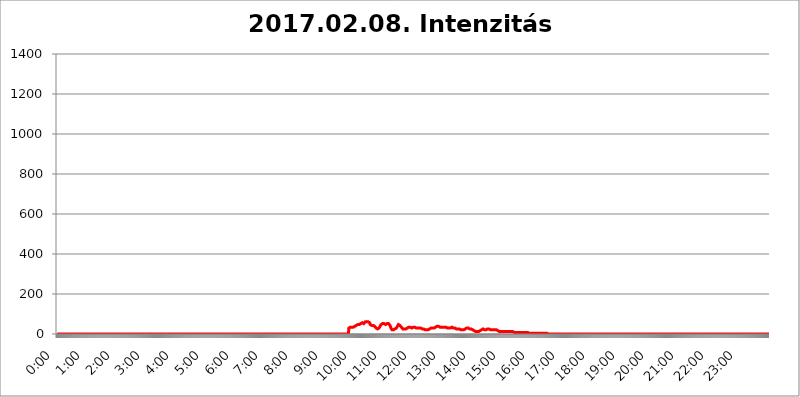
| Category | 2017.02.08. Intenzitás [W/m^2] |
|---|---|
| 0.0 | 0 |
| 0.0006944444444444445 | 0 |
| 0.001388888888888889 | 0 |
| 0.0020833333333333333 | 0 |
| 0.002777777777777778 | 0 |
| 0.003472222222222222 | 0 |
| 0.004166666666666667 | 0 |
| 0.004861111111111111 | 0 |
| 0.005555555555555556 | 0 |
| 0.0062499999999999995 | 0 |
| 0.006944444444444444 | 0 |
| 0.007638888888888889 | 0 |
| 0.008333333333333333 | 0 |
| 0.009027777777777779 | 0 |
| 0.009722222222222222 | 0 |
| 0.010416666666666666 | 0 |
| 0.011111111111111112 | 0 |
| 0.011805555555555555 | 0 |
| 0.012499999999999999 | 0 |
| 0.013194444444444444 | 0 |
| 0.013888888888888888 | 0 |
| 0.014583333333333332 | 0 |
| 0.015277777777777777 | 0 |
| 0.015972222222222224 | 0 |
| 0.016666666666666666 | 0 |
| 0.017361111111111112 | 0 |
| 0.018055555555555557 | 0 |
| 0.01875 | 0 |
| 0.019444444444444445 | 0 |
| 0.02013888888888889 | 0 |
| 0.020833333333333332 | 0 |
| 0.02152777777777778 | 0 |
| 0.022222222222222223 | 0 |
| 0.02291666666666667 | 0 |
| 0.02361111111111111 | 0 |
| 0.024305555555555556 | 0 |
| 0.024999999999999998 | 0 |
| 0.025694444444444447 | 0 |
| 0.02638888888888889 | 0 |
| 0.027083333333333334 | 0 |
| 0.027777777777777776 | 0 |
| 0.02847222222222222 | 0 |
| 0.029166666666666664 | 0 |
| 0.029861111111111113 | 0 |
| 0.030555555555555555 | 0 |
| 0.03125 | 0 |
| 0.03194444444444445 | 0 |
| 0.03263888888888889 | 0 |
| 0.03333333333333333 | 0 |
| 0.034027777777777775 | 0 |
| 0.034722222222222224 | 0 |
| 0.035416666666666666 | 0 |
| 0.036111111111111115 | 0 |
| 0.03680555555555556 | 0 |
| 0.0375 | 0 |
| 0.03819444444444444 | 0 |
| 0.03888888888888889 | 0 |
| 0.03958333333333333 | 0 |
| 0.04027777777777778 | 0 |
| 0.04097222222222222 | 0 |
| 0.041666666666666664 | 0 |
| 0.042361111111111106 | 0 |
| 0.04305555555555556 | 0 |
| 0.043750000000000004 | 0 |
| 0.044444444444444446 | 0 |
| 0.04513888888888889 | 0 |
| 0.04583333333333334 | 0 |
| 0.04652777777777778 | 0 |
| 0.04722222222222222 | 0 |
| 0.04791666666666666 | 0 |
| 0.04861111111111111 | 0 |
| 0.049305555555555554 | 0 |
| 0.049999999999999996 | 0 |
| 0.05069444444444445 | 0 |
| 0.051388888888888894 | 0 |
| 0.052083333333333336 | 0 |
| 0.05277777777777778 | 0 |
| 0.05347222222222222 | 0 |
| 0.05416666666666667 | 0 |
| 0.05486111111111111 | 0 |
| 0.05555555555555555 | 0 |
| 0.05625 | 0 |
| 0.05694444444444444 | 0 |
| 0.057638888888888885 | 0 |
| 0.05833333333333333 | 0 |
| 0.05902777777777778 | 0 |
| 0.059722222222222225 | 0 |
| 0.06041666666666667 | 0 |
| 0.061111111111111116 | 0 |
| 0.06180555555555556 | 0 |
| 0.0625 | 0 |
| 0.06319444444444444 | 0 |
| 0.06388888888888888 | 0 |
| 0.06458333333333334 | 0 |
| 0.06527777777777778 | 0 |
| 0.06597222222222222 | 0 |
| 0.06666666666666667 | 0 |
| 0.06736111111111111 | 0 |
| 0.06805555555555555 | 0 |
| 0.06874999999999999 | 0 |
| 0.06944444444444443 | 0 |
| 0.07013888888888889 | 0 |
| 0.07083333333333333 | 0 |
| 0.07152777777777779 | 0 |
| 0.07222222222222223 | 0 |
| 0.07291666666666667 | 0 |
| 0.07361111111111111 | 0 |
| 0.07430555555555556 | 0 |
| 0.075 | 0 |
| 0.07569444444444444 | 0 |
| 0.0763888888888889 | 0 |
| 0.07708333333333334 | 0 |
| 0.07777777777777778 | 0 |
| 0.07847222222222222 | 0 |
| 0.07916666666666666 | 0 |
| 0.0798611111111111 | 0 |
| 0.08055555555555556 | 0 |
| 0.08125 | 0 |
| 0.08194444444444444 | 0 |
| 0.08263888888888889 | 0 |
| 0.08333333333333333 | 0 |
| 0.08402777777777777 | 0 |
| 0.08472222222222221 | 0 |
| 0.08541666666666665 | 0 |
| 0.08611111111111112 | 0 |
| 0.08680555555555557 | 0 |
| 0.08750000000000001 | 0 |
| 0.08819444444444445 | 0 |
| 0.08888888888888889 | 0 |
| 0.08958333333333333 | 0 |
| 0.09027777777777778 | 0 |
| 0.09097222222222222 | 0 |
| 0.09166666666666667 | 0 |
| 0.09236111111111112 | 0 |
| 0.09305555555555556 | 0 |
| 0.09375 | 0 |
| 0.09444444444444444 | 0 |
| 0.09513888888888888 | 0 |
| 0.09583333333333333 | 0 |
| 0.09652777777777777 | 0 |
| 0.09722222222222222 | 0 |
| 0.09791666666666667 | 0 |
| 0.09861111111111111 | 0 |
| 0.09930555555555555 | 0 |
| 0.09999999999999999 | 0 |
| 0.10069444444444443 | 0 |
| 0.1013888888888889 | 0 |
| 0.10208333333333335 | 0 |
| 0.10277777777777779 | 0 |
| 0.10347222222222223 | 0 |
| 0.10416666666666667 | 0 |
| 0.10486111111111111 | 0 |
| 0.10555555555555556 | 0 |
| 0.10625 | 0 |
| 0.10694444444444444 | 0 |
| 0.1076388888888889 | 0 |
| 0.10833333333333334 | 0 |
| 0.10902777777777778 | 0 |
| 0.10972222222222222 | 0 |
| 0.1111111111111111 | 0 |
| 0.11180555555555556 | 0 |
| 0.11180555555555556 | 0 |
| 0.1125 | 0 |
| 0.11319444444444444 | 0 |
| 0.11388888888888889 | 0 |
| 0.11458333333333333 | 0 |
| 0.11527777777777777 | 0 |
| 0.11597222222222221 | 0 |
| 0.11666666666666665 | 0 |
| 0.1173611111111111 | 0 |
| 0.11805555555555557 | 0 |
| 0.11944444444444445 | 0 |
| 0.12013888888888889 | 0 |
| 0.12083333333333333 | 0 |
| 0.12152777777777778 | 0 |
| 0.12222222222222223 | 0 |
| 0.12291666666666667 | 0 |
| 0.12291666666666667 | 0 |
| 0.12361111111111112 | 0 |
| 0.12430555555555556 | 0 |
| 0.125 | 0 |
| 0.12569444444444444 | 0 |
| 0.12638888888888888 | 0 |
| 0.12708333333333333 | 0 |
| 0.16875 | 0 |
| 0.12847222222222224 | 0 |
| 0.12916666666666668 | 0 |
| 0.12986111111111112 | 0 |
| 0.13055555555555556 | 0 |
| 0.13125 | 0 |
| 0.13194444444444445 | 0 |
| 0.1326388888888889 | 0 |
| 0.13333333333333333 | 0 |
| 0.13402777777777777 | 0 |
| 0.13402777777777777 | 0 |
| 0.13472222222222222 | 0 |
| 0.13541666666666666 | 0 |
| 0.1361111111111111 | 0 |
| 0.13749999999999998 | 0 |
| 0.13819444444444443 | 0 |
| 0.1388888888888889 | 0 |
| 0.13958333333333334 | 0 |
| 0.14027777777777778 | 0 |
| 0.14097222222222222 | 0 |
| 0.14166666666666666 | 0 |
| 0.1423611111111111 | 0 |
| 0.14305555555555557 | 0 |
| 0.14375000000000002 | 0 |
| 0.14444444444444446 | 0 |
| 0.1451388888888889 | 0 |
| 0.1451388888888889 | 0 |
| 0.14652777777777778 | 0 |
| 0.14722222222222223 | 0 |
| 0.14791666666666667 | 0 |
| 0.1486111111111111 | 0 |
| 0.14930555555555555 | 0 |
| 0.15 | 0 |
| 0.15069444444444444 | 0 |
| 0.15138888888888888 | 0 |
| 0.15208333333333332 | 0 |
| 0.15277777777777776 | 0 |
| 0.15347222222222223 | 0 |
| 0.15416666666666667 | 0 |
| 0.15486111111111112 | 0 |
| 0.15555555555555556 | 0 |
| 0.15625 | 0 |
| 0.15694444444444444 | 0 |
| 0.15763888888888888 | 0 |
| 0.15833333333333333 | 0 |
| 0.15902777777777777 | 0 |
| 0.15972222222222224 | 0 |
| 0.16041666666666668 | 0 |
| 0.16111111111111112 | 0 |
| 0.16180555555555556 | 0 |
| 0.1625 | 0 |
| 0.16319444444444445 | 0 |
| 0.1638888888888889 | 0 |
| 0.16458333333333333 | 0 |
| 0.16527777777777777 | 0 |
| 0.16597222222222222 | 0 |
| 0.16666666666666666 | 0 |
| 0.1673611111111111 | 0 |
| 0.16805555555555554 | 0 |
| 0.16874999999999998 | 0 |
| 0.16944444444444443 | 0 |
| 0.17013888888888887 | 0 |
| 0.1708333333333333 | 0 |
| 0.17152777777777775 | 0 |
| 0.17222222222222225 | 0 |
| 0.1729166666666667 | 0 |
| 0.17361111111111113 | 0 |
| 0.17430555555555557 | 0 |
| 0.17500000000000002 | 0 |
| 0.17569444444444446 | 0 |
| 0.1763888888888889 | 0 |
| 0.17708333333333334 | 0 |
| 0.17777777777777778 | 0 |
| 0.17847222222222223 | 0 |
| 0.17916666666666667 | 0 |
| 0.1798611111111111 | 0 |
| 0.18055555555555555 | 0 |
| 0.18125 | 0 |
| 0.18194444444444444 | 0 |
| 0.1826388888888889 | 0 |
| 0.18333333333333335 | 0 |
| 0.1840277777777778 | 0 |
| 0.18472222222222223 | 0 |
| 0.18541666666666667 | 0 |
| 0.18611111111111112 | 0 |
| 0.18680555555555556 | 0 |
| 0.1875 | 0 |
| 0.18819444444444444 | 0 |
| 0.18888888888888888 | 0 |
| 0.18958333333333333 | 0 |
| 0.19027777777777777 | 0 |
| 0.1909722222222222 | 0 |
| 0.19166666666666665 | 0 |
| 0.19236111111111112 | 0 |
| 0.19305555555555554 | 0 |
| 0.19375 | 0 |
| 0.19444444444444445 | 0 |
| 0.1951388888888889 | 0 |
| 0.19583333333333333 | 0 |
| 0.19652777777777777 | 0 |
| 0.19722222222222222 | 0 |
| 0.19791666666666666 | 0 |
| 0.1986111111111111 | 0 |
| 0.19930555555555554 | 0 |
| 0.19999999999999998 | 0 |
| 0.20069444444444443 | 0 |
| 0.20138888888888887 | 0 |
| 0.2020833333333333 | 0 |
| 0.2027777777777778 | 0 |
| 0.2034722222222222 | 0 |
| 0.2041666666666667 | 0 |
| 0.20486111111111113 | 0 |
| 0.20555555555555557 | 0 |
| 0.20625000000000002 | 0 |
| 0.20694444444444446 | 0 |
| 0.2076388888888889 | 0 |
| 0.20833333333333334 | 0 |
| 0.20902777777777778 | 0 |
| 0.20972222222222223 | 0 |
| 0.21041666666666667 | 0 |
| 0.2111111111111111 | 0 |
| 0.21180555555555555 | 0 |
| 0.2125 | 0 |
| 0.21319444444444444 | 0 |
| 0.2138888888888889 | 0 |
| 0.21458333333333335 | 0 |
| 0.2152777777777778 | 0 |
| 0.21597222222222223 | 0 |
| 0.21666666666666667 | 0 |
| 0.21736111111111112 | 0 |
| 0.21805555555555556 | 0 |
| 0.21875 | 0 |
| 0.21944444444444444 | 0 |
| 0.22013888888888888 | 0 |
| 0.22083333333333333 | 0 |
| 0.22152777777777777 | 0 |
| 0.2222222222222222 | 0 |
| 0.22291666666666665 | 0 |
| 0.2236111111111111 | 0 |
| 0.22430555555555556 | 0 |
| 0.225 | 0 |
| 0.22569444444444445 | 0 |
| 0.2263888888888889 | 0 |
| 0.22708333333333333 | 0 |
| 0.22777777777777777 | 0 |
| 0.22847222222222222 | 0 |
| 0.22916666666666666 | 0 |
| 0.2298611111111111 | 0 |
| 0.23055555555555554 | 0 |
| 0.23124999999999998 | 0 |
| 0.23194444444444443 | 0 |
| 0.23263888888888887 | 0 |
| 0.2333333333333333 | 0 |
| 0.2340277777777778 | 0 |
| 0.2347222222222222 | 0 |
| 0.2354166666666667 | 0 |
| 0.23611111111111113 | 0 |
| 0.23680555555555557 | 0 |
| 0.23750000000000002 | 0 |
| 0.23819444444444446 | 0 |
| 0.2388888888888889 | 0 |
| 0.23958333333333334 | 0 |
| 0.24027777777777778 | 0 |
| 0.24097222222222223 | 0 |
| 0.24166666666666667 | 0 |
| 0.2423611111111111 | 0 |
| 0.24305555555555555 | 0 |
| 0.24375 | 0 |
| 0.24444444444444446 | 0 |
| 0.24513888888888888 | 0 |
| 0.24583333333333335 | 0 |
| 0.2465277777777778 | 0 |
| 0.24722222222222223 | 0 |
| 0.24791666666666667 | 0 |
| 0.24861111111111112 | 0 |
| 0.24930555555555556 | 0 |
| 0.25 | 0 |
| 0.25069444444444444 | 0 |
| 0.2513888888888889 | 0 |
| 0.2520833333333333 | 0 |
| 0.25277777777777777 | 0 |
| 0.2534722222222222 | 0 |
| 0.25416666666666665 | 0 |
| 0.2548611111111111 | 0 |
| 0.2555555555555556 | 0 |
| 0.25625000000000003 | 0 |
| 0.2569444444444445 | 0 |
| 0.2576388888888889 | 0 |
| 0.25833333333333336 | 0 |
| 0.2590277777777778 | 0 |
| 0.25972222222222224 | 0 |
| 0.2604166666666667 | 0 |
| 0.2611111111111111 | 0 |
| 0.26180555555555557 | 0 |
| 0.2625 | 0 |
| 0.26319444444444445 | 0 |
| 0.2638888888888889 | 0 |
| 0.26458333333333334 | 0 |
| 0.2652777777777778 | 0 |
| 0.2659722222222222 | 0 |
| 0.26666666666666666 | 0 |
| 0.2673611111111111 | 0 |
| 0.26805555555555555 | 0 |
| 0.26875 | 0 |
| 0.26944444444444443 | 0 |
| 0.2701388888888889 | 0 |
| 0.2708333333333333 | 0 |
| 0.27152777777777776 | 0 |
| 0.2722222222222222 | 0 |
| 0.27291666666666664 | 0 |
| 0.2736111111111111 | 0 |
| 0.2743055555555555 | 0 |
| 0.27499999999999997 | 0 |
| 0.27569444444444446 | 0 |
| 0.27638888888888885 | 0 |
| 0.27708333333333335 | 0 |
| 0.2777777777777778 | 0 |
| 0.27847222222222223 | 0 |
| 0.2791666666666667 | 0 |
| 0.2798611111111111 | 0 |
| 0.28055555555555556 | 0 |
| 0.28125 | 0 |
| 0.28194444444444444 | 0 |
| 0.2826388888888889 | 0 |
| 0.2833333333333333 | 0 |
| 0.28402777777777777 | 0 |
| 0.2847222222222222 | 0 |
| 0.28541666666666665 | 0 |
| 0.28611111111111115 | 0 |
| 0.28680555555555554 | 0 |
| 0.28750000000000003 | 0 |
| 0.2881944444444445 | 0 |
| 0.2888888888888889 | 0 |
| 0.28958333333333336 | 0 |
| 0.2902777777777778 | 0 |
| 0.29097222222222224 | 0 |
| 0.2916666666666667 | 0 |
| 0.2923611111111111 | 0 |
| 0.29305555555555557 | 0 |
| 0.29375 | 0 |
| 0.29444444444444445 | 0 |
| 0.2951388888888889 | 0 |
| 0.29583333333333334 | 0 |
| 0.2965277777777778 | 0 |
| 0.2972222222222222 | 0 |
| 0.29791666666666666 | 0 |
| 0.2986111111111111 | 0 |
| 0.29930555555555555 | 0 |
| 0.3 | 0 |
| 0.30069444444444443 | 0 |
| 0.3013888888888889 | 0 |
| 0.3020833333333333 | 0 |
| 0.30277777777777776 | 0 |
| 0.3034722222222222 | 0 |
| 0.30416666666666664 | 0 |
| 0.3048611111111111 | 0 |
| 0.3055555555555555 | 0 |
| 0.30624999999999997 | 0 |
| 0.3069444444444444 | 0 |
| 0.3076388888888889 | 0 |
| 0.30833333333333335 | 0 |
| 0.3090277777777778 | 0 |
| 0.30972222222222223 | 0 |
| 0.3104166666666667 | 0 |
| 0.3111111111111111 | 0 |
| 0.31180555555555556 | 0 |
| 0.3125 | 0 |
| 0.31319444444444444 | 0 |
| 0.3138888888888889 | 0 |
| 0.3145833333333333 | 0 |
| 0.31527777777777777 | 0 |
| 0.3159722222222222 | 0 |
| 0.31666666666666665 | 0 |
| 0.31736111111111115 | 0 |
| 0.31805555555555554 | 0 |
| 0.31875000000000003 | 0 |
| 0.3194444444444445 | 0 |
| 0.3201388888888889 | 0 |
| 0.32083333333333336 | 0 |
| 0.3215277777777778 | 0 |
| 0.32222222222222224 | 0 |
| 0.3229166666666667 | 0 |
| 0.3236111111111111 | 0 |
| 0.32430555555555557 | 0 |
| 0.325 | 0 |
| 0.32569444444444445 | 0 |
| 0.3263888888888889 | 0 |
| 0.32708333333333334 | 0 |
| 0.3277777777777778 | 0 |
| 0.3284722222222222 | 0 |
| 0.32916666666666666 | 0 |
| 0.3298611111111111 | 0 |
| 0.33055555555555555 | 0 |
| 0.33125 | 0 |
| 0.33194444444444443 | 0 |
| 0.3326388888888889 | 0 |
| 0.3333333333333333 | 0 |
| 0.3340277777777778 | 0 |
| 0.3347222222222222 | 0 |
| 0.3354166666666667 | 0 |
| 0.3361111111111111 | 0 |
| 0.3368055555555556 | 0 |
| 0.33749999999999997 | 0 |
| 0.33819444444444446 | 0 |
| 0.33888888888888885 | 0 |
| 0.33958333333333335 | 0 |
| 0.34027777777777773 | 0 |
| 0.34097222222222223 | 0 |
| 0.3416666666666666 | 0 |
| 0.3423611111111111 | 0 |
| 0.3430555555555555 | 0 |
| 0.34375 | 0 |
| 0.3444444444444445 | 0 |
| 0.3451388888888889 | 0 |
| 0.3458333333333334 | 0 |
| 0.34652777777777777 | 0 |
| 0.34722222222222227 | 0 |
| 0.34791666666666665 | 0 |
| 0.34861111111111115 | 0 |
| 0.34930555555555554 | 0 |
| 0.35000000000000003 | 0 |
| 0.3506944444444444 | 0 |
| 0.3513888888888889 | 0 |
| 0.3520833333333333 | 0 |
| 0.3527777777777778 | 0 |
| 0.3534722222222222 | 0 |
| 0.3541666666666667 | 0 |
| 0.3548611111111111 | 0 |
| 0.35555555555555557 | 0 |
| 0.35625 | 0 |
| 0.35694444444444445 | 0 |
| 0.3576388888888889 | 0 |
| 0.35833333333333334 | 0 |
| 0.3590277777777778 | 0 |
| 0.3597222222222222 | 0 |
| 0.36041666666666666 | 0 |
| 0.3611111111111111 | 0 |
| 0.36180555555555555 | 0 |
| 0.3625 | 0 |
| 0.36319444444444443 | 0 |
| 0.3638888888888889 | 0 |
| 0.3645833333333333 | 0 |
| 0.3652777777777778 | 0 |
| 0.3659722222222222 | 0 |
| 0.3666666666666667 | 0 |
| 0.3673611111111111 | 0 |
| 0.3680555555555556 | 0 |
| 0.36874999999999997 | 0 |
| 0.36944444444444446 | 0 |
| 0.37013888888888885 | 0 |
| 0.37083333333333335 | 0 |
| 0.37152777777777773 | 0 |
| 0.37222222222222223 | 0 |
| 0.3729166666666666 | 0 |
| 0.3736111111111111 | 0 |
| 0.3743055555555555 | 0 |
| 0.375 | 0 |
| 0.3756944444444445 | 0 |
| 0.3763888888888889 | 0 |
| 0.3770833333333334 | 0 |
| 0.37777777777777777 | 0 |
| 0.37847222222222227 | 0 |
| 0.37916666666666665 | 0 |
| 0.37986111111111115 | 0 |
| 0.38055555555555554 | 0 |
| 0.38125000000000003 | 0 |
| 0.3819444444444444 | 0 |
| 0.3826388888888889 | 0 |
| 0.3833333333333333 | 0 |
| 0.3840277777777778 | 0 |
| 0.3847222222222222 | 0 |
| 0.3854166666666667 | 0 |
| 0.3861111111111111 | 0 |
| 0.38680555555555557 | 0 |
| 0.3875 | 0 |
| 0.38819444444444445 | 0 |
| 0.3888888888888889 | 0 |
| 0.38958333333333334 | 0 |
| 0.3902777777777778 | 0 |
| 0.3909722222222222 | 0 |
| 0.39166666666666666 | 0 |
| 0.3923611111111111 | 0 |
| 0.39305555555555555 | 0 |
| 0.39375 | 0 |
| 0.39444444444444443 | 0 |
| 0.3951388888888889 | 0 |
| 0.3958333333333333 | 0 |
| 0.3965277777777778 | 0 |
| 0.3972222222222222 | 0 |
| 0.3979166666666667 | 0 |
| 0.3986111111111111 | 0 |
| 0.3993055555555556 | 0 |
| 0.39999999999999997 | 0 |
| 0.40069444444444446 | 0 |
| 0.40138888888888885 | 0 |
| 0.40208333333333335 | 0 |
| 0.40277777777777773 | 0 |
| 0.40347222222222223 | 0 |
| 0.4041666666666666 | 0 |
| 0.4048611111111111 | 0 |
| 0.4055555555555555 | 0 |
| 0.40625 | 0 |
| 0.4069444444444445 | 0 |
| 0.4076388888888889 | 0 |
| 0.4083333333333334 | 0 |
| 0.40902777777777777 | 29.823 |
| 0.40972222222222227 | 34.234 |
| 0.41041666666666665 | 34.234 |
| 0.41111111111111115 | 34.234 |
| 0.41180555555555554 | 34.234 |
| 0.41250000000000003 | 34.234 |
| 0.4131944444444444 | 34.234 |
| 0.4138888888888889 | 34.234 |
| 0.4145833333333333 | 34.234 |
| 0.4152777777777778 | 34.234 |
| 0.4159722222222222 | 34.234 |
| 0.4166666666666667 | 34.234 |
| 0.4173611111111111 | 38.653 |
| 0.41805555555555557 | 38.653 |
| 0.41875 | 38.653 |
| 0.41944444444444445 | 43.079 |
| 0.4201388888888889 | 47.511 |
| 0.42083333333333334 | 47.511 |
| 0.4215277777777778 | 47.511 |
| 0.4222222222222222 | 47.511 |
| 0.42291666666666666 | 47.511 |
| 0.4236111111111111 | 47.511 |
| 0.42430555555555555 | 47.511 |
| 0.425 | 51.951 |
| 0.42569444444444443 | 51.951 |
| 0.4263888888888889 | 51.951 |
| 0.4270833333333333 | 51.951 |
| 0.4277777777777778 | 56.398 |
| 0.4284722222222222 | 51.951 |
| 0.4291666666666667 | 51.951 |
| 0.4298611111111111 | 51.951 |
| 0.4305555555555556 | 56.398 |
| 0.43124999999999997 | 56.398 |
| 0.43194444444444446 | 60.85 |
| 0.43263888888888885 | 60.85 |
| 0.43333333333333335 | 56.398 |
| 0.43402777777777773 | 60.85 |
| 0.43472222222222223 | 60.85 |
| 0.4354166666666666 | 60.85 |
| 0.4361111111111111 | 60.85 |
| 0.4368055555555555 | 60.85 |
| 0.4375 | 56.398 |
| 0.4381944444444445 | 56.398 |
| 0.4388888888888889 | 47.511 |
| 0.4395833333333334 | 47.511 |
| 0.44027777777777777 | 47.511 |
| 0.44097222222222227 | 43.079 |
| 0.44166666666666665 | 43.079 |
| 0.44236111111111115 | 47.511 |
| 0.44305555555555554 | 43.079 |
| 0.44375000000000003 | 43.079 |
| 0.4444444444444444 | 38.653 |
| 0.4451388888888889 | 38.653 |
| 0.4458333333333333 | 34.234 |
| 0.4465277777777778 | 34.234 |
| 0.4472222222222222 | 29.823 |
| 0.4479166666666667 | 29.823 |
| 0.4486111111111111 | 25.419 |
| 0.44930555555555557 | 25.419 |
| 0.45 | 29.823 |
| 0.45069444444444445 | 29.823 |
| 0.4513888888888889 | 29.823 |
| 0.45208333333333334 | 34.234 |
| 0.4527777777777778 | 38.653 |
| 0.4534722222222222 | 43.079 |
| 0.45416666666666666 | 47.511 |
| 0.4548611111111111 | 47.511 |
| 0.45555555555555555 | 51.951 |
| 0.45625 | 51.951 |
| 0.45694444444444443 | 51.951 |
| 0.4576388888888889 | 51.951 |
| 0.4583333333333333 | 51.951 |
| 0.4590277777777778 | 51.951 |
| 0.4597222222222222 | 47.511 |
| 0.4604166666666667 | 47.511 |
| 0.4611111111111111 | 47.511 |
| 0.4618055555555556 | 51.951 |
| 0.46249999999999997 | 51.951 |
| 0.46319444444444446 | 51.951 |
| 0.46388888888888885 | 51.951 |
| 0.46458333333333335 | 51.951 |
| 0.46527777777777773 | 47.511 |
| 0.46597222222222223 | 47.511 |
| 0.4666666666666666 | 43.079 |
| 0.4673611111111111 | 38.653 |
| 0.4680555555555555 | 29.823 |
| 0.46875 | 25.419 |
| 0.4694444444444445 | 21.024 |
| 0.4701388888888889 | 21.024 |
| 0.4708333333333334 | 21.024 |
| 0.47152777777777777 | 21.024 |
| 0.47222222222222227 | 21.024 |
| 0.47291666666666665 | 21.024 |
| 0.47361111111111115 | 25.419 |
| 0.47430555555555554 | 25.419 |
| 0.47500000000000003 | 29.823 |
| 0.4756944444444444 | 29.823 |
| 0.4763888888888889 | 34.234 |
| 0.4770833333333333 | 38.653 |
| 0.4777777777777778 | 43.079 |
| 0.4784722222222222 | 47.511 |
| 0.4791666666666667 | 47.511 |
| 0.4798611111111111 | 43.079 |
| 0.48055555555555557 | 43.079 |
| 0.48125 | 43.079 |
| 0.48194444444444445 | 38.653 |
| 0.4826388888888889 | 34.234 |
| 0.48333333333333334 | 29.823 |
| 0.4840277777777778 | 29.823 |
| 0.4847222222222222 | 25.419 |
| 0.48541666666666666 | 25.419 |
| 0.4861111111111111 | 25.419 |
| 0.48680555555555555 | 25.419 |
| 0.4875 | 25.419 |
| 0.48819444444444443 | 25.419 |
| 0.4888888888888889 | 25.419 |
| 0.4895833333333333 | 29.823 |
| 0.4902777777777778 | 29.823 |
| 0.4909722222222222 | 29.823 |
| 0.4916666666666667 | 34.234 |
| 0.4923611111111111 | 34.234 |
| 0.4930555555555556 | 34.234 |
| 0.49374999999999997 | 34.234 |
| 0.49444444444444446 | 34.234 |
| 0.49513888888888885 | 34.234 |
| 0.49583333333333335 | 29.823 |
| 0.49652777777777773 | 29.823 |
| 0.49722222222222223 | 29.823 |
| 0.4979166666666666 | 34.234 |
| 0.4986111111111111 | 34.234 |
| 0.4993055555555555 | 34.234 |
| 0.5 | 34.234 |
| 0.5006944444444444 | 34.234 |
| 0.5013888888888889 | 34.234 |
| 0.5020833333333333 | 34.234 |
| 0.5027777777777778 | 34.234 |
| 0.5034722222222222 | 29.823 |
| 0.5041666666666667 | 29.823 |
| 0.5048611111111111 | 29.823 |
| 0.5055555555555555 | 29.823 |
| 0.50625 | 29.823 |
| 0.5069444444444444 | 29.823 |
| 0.5076388888888889 | 29.823 |
| 0.5083333333333333 | 29.823 |
| 0.5090277777777777 | 29.823 |
| 0.5097222222222222 | 29.823 |
| 0.5104166666666666 | 29.823 |
| 0.5111111111111112 | 25.419 |
| 0.5118055555555555 | 25.419 |
| 0.5125000000000001 | 25.419 |
| 0.5131944444444444 | 25.419 |
| 0.513888888888889 | 25.419 |
| 0.5145833333333333 | 25.419 |
| 0.5152777777777778 | 21.024 |
| 0.5159722222222222 | 21.024 |
| 0.5166666666666667 | 21.024 |
| 0.517361111111111 | 21.024 |
| 0.5180555555555556 | 21.024 |
| 0.5187499999999999 | 21.024 |
| 0.5194444444444445 | 21.024 |
| 0.5201388888888888 | 21.024 |
| 0.5208333333333334 | 21.024 |
| 0.5215277777777778 | 21.024 |
| 0.5222222222222223 | 25.419 |
| 0.5229166666666667 | 25.419 |
| 0.5236111111111111 | 29.823 |
| 0.5243055555555556 | 29.823 |
| 0.525 | 29.823 |
| 0.5256944444444445 | 29.823 |
| 0.5263888888888889 | 29.823 |
| 0.5270833333333333 | 29.823 |
| 0.5277777777777778 | 29.823 |
| 0.5284722222222222 | 29.823 |
| 0.5291666666666667 | 29.823 |
| 0.5298611111111111 | 29.823 |
| 0.5305555555555556 | 34.234 |
| 0.53125 | 34.234 |
| 0.5319444444444444 | 34.234 |
| 0.5326388888888889 | 38.653 |
| 0.5333333333333333 | 38.653 |
| 0.5340277777777778 | 38.653 |
| 0.5347222222222222 | 38.653 |
| 0.5354166666666667 | 38.653 |
| 0.5361111111111111 | 34.234 |
| 0.5368055555555555 | 34.234 |
| 0.5375 | 34.234 |
| 0.5381944444444444 | 34.234 |
| 0.5388888888888889 | 34.234 |
| 0.5395833333333333 | 34.234 |
| 0.5402777777777777 | 34.234 |
| 0.5409722222222222 | 34.234 |
| 0.5416666666666666 | 29.823 |
| 0.5423611111111112 | 34.234 |
| 0.5430555555555555 | 34.234 |
| 0.5437500000000001 | 34.234 |
| 0.5444444444444444 | 34.234 |
| 0.545138888888889 | 34.234 |
| 0.5458333333333333 | 29.823 |
| 0.5465277777777778 | 29.823 |
| 0.5472222222222222 | 29.823 |
| 0.5479166666666667 | 29.823 |
| 0.548611111111111 | 29.823 |
| 0.5493055555555556 | 29.823 |
| 0.5499999999999999 | 29.823 |
| 0.5506944444444445 | 29.823 |
| 0.5513888888888888 | 29.823 |
| 0.5520833333333334 | 34.234 |
| 0.5527777777777778 | 34.234 |
| 0.5534722222222223 | 34.234 |
| 0.5541666666666667 | 29.823 |
| 0.5548611111111111 | 29.823 |
| 0.5555555555555556 | 29.823 |
| 0.55625 | 29.823 |
| 0.5569444444444445 | 29.823 |
| 0.5576388888888889 | 29.823 |
| 0.5583333333333333 | 29.823 |
| 0.5590277777777778 | 25.419 |
| 0.5597222222222222 | 25.419 |
| 0.5604166666666667 | 25.419 |
| 0.5611111111111111 | 25.419 |
| 0.5618055555555556 | 25.419 |
| 0.5625 | 25.419 |
| 0.5631944444444444 | 25.419 |
| 0.5638888888888889 | 25.419 |
| 0.5645833333333333 | 21.024 |
| 0.5652777777777778 | 21.024 |
| 0.5659722222222222 | 21.024 |
| 0.5666666666666667 | 21.024 |
| 0.5673611111111111 | 21.024 |
| 0.5680555555555555 | 21.024 |
| 0.56875 | 21.024 |
| 0.5694444444444444 | 21.024 |
| 0.5701388888888889 | 21.024 |
| 0.5708333333333333 | 25.419 |
| 0.5715277777777777 | 25.419 |
| 0.5722222222222222 | 25.419 |
| 0.5729166666666666 | 29.823 |
| 0.5736111111111112 | 29.823 |
| 0.5743055555555555 | 29.823 |
| 0.5750000000000001 | 29.823 |
| 0.5756944444444444 | 29.823 |
| 0.576388888888889 | 29.823 |
| 0.5770833333333333 | 29.823 |
| 0.5777777777777778 | 25.419 |
| 0.5784722222222222 | 25.419 |
| 0.5791666666666667 | 25.419 |
| 0.579861111111111 | 25.419 |
| 0.5805555555555556 | 25.419 |
| 0.5812499999999999 | 25.419 |
| 0.5819444444444445 | 25.419 |
| 0.5826388888888888 | 21.024 |
| 0.5833333333333334 | 21.024 |
| 0.5840277777777778 | 21.024 |
| 0.5847222222222223 | 16.636 |
| 0.5854166666666667 | 16.636 |
| 0.5861111111111111 | 16.636 |
| 0.5868055555555556 | 12.257 |
| 0.5875 | 12.257 |
| 0.5881944444444445 | 12.257 |
| 0.5888888888888889 | 12.257 |
| 0.5895833333333333 | 12.257 |
| 0.5902777777777778 | 12.257 |
| 0.5909722222222222 | 12.257 |
| 0.5916666666666667 | 12.257 |
| 0.5923611111111111 | 16.636 |
| 0.5930555555555556 | 16.636 |
| 0.59375 | 21.024 |
| 0.5944444444444444 | 21.024 |
| 0.5951388888888889 | 21.024 |
| 0.5958333333333333 | 21.024 |
| 0.5965277777777778 | 21.024 |
| 0.5972222222222222 | 25.419 |
| 0.5979166666666667 | 25.419 |
| 0.5986111111111111 | 25.419 |
| 0.5993055555555555 | 21.024 |
| 0.6 | 25.419 |
| 0.6006944444444444 | 21.024 |
| 0.6013888888888889 | 21.024 |
| 0.6020833333333333 | 25.419 |
| 0.6027777777777777 | 25.419 |
| 0.6034722222222222 | 25.419 |
| 0.6041666666666666 | 25.419 |
| 0.6048611111111112 | 25.419 |
| 0.6055555555555555 | 25.419 |
| 0.6062500000000001 | 21.024 |
| 0.6069444444444444 | 21.024 |
| 0.607638888888889 | 21.024 |
| 0.6083333333333333 | 21.024 |
| 0.6090277777777778 | 21.024 |
| 0.6097222222222222 | 21.024 |
| 0.6104166666666667 | 21.024 |
| 0.611111111111111 | 21.024 |
| 0.6118055555555556 | 21.024 |
| 0.6124999999999999 | 21.024 |
| 0.6131944444444445 | 21.024 |
| 0.6138888888888888 | 21.024 |
| 0.6145833333333334 | 21.024 |
| 0.6152777777777778 | 21.024 |
| 0.6159722222222223 | 21.024 |
| 0.6166666666666667 | 16.636 |
| 0.6173611111111111 | 21.024 |
| 0.6180555555555556 | 16.636 |
| 0.61875 | 16.636 |
| 0.6194444444444445 | 16.636 |
| 0.6201388888888889 | 12.257 |
| 0.6208333333333333 | 12.257 |
| 0.6215277777777778 | 12.257 |
| 0.6222222222222222 | 12.257 |
| 0.6229166666666667 | 12.257 |
| 0.6236111111111111 | 12.257 |
| 0.6243055555555556 | 12.257 |
| 0.625 | 12.257 |
| 0.6256944444444444 | 12.257 |
| 0.6263888888888889 | 12.257 |
| 0.6270833333333333 | 12.257 |
| 0.6277777777777778 | 12.257 |
| 0.6284722222222222 | 12.257 |
| 0.6291666666666667 | 12.257 |
| 0.6298611111111111 | 12.257 |
| 0.6305555555555555 | 12.257 |
| 0.63125 | 7.887 |
| 0.6319444444444444 | 7.887 |
| 0.6326388888888889 | 12.257 |
| 0.6333333333333333 | 7.887 |
| 0.6340277777777777 | 12.257 |
| 0.6347222222222222 | 12.257 |
| 0.6354166666666666 | 12.257 |
| 0.6361111111111112 | 12.257 |
| 0.6368055555555555 | 12.257 |
| 0.6375000000000001 | 12.257 |
| 0.6381944444444444 | 12.257 |
| 0.638888888888889 | 12.257 |
| 0.6395833333333333 | 7.887 |
| 0.6402777777777778 | 7.887 |
| 0.6409722222222222 | 7.887 |
| 0.6416666666666667 | 7.887 |
| 0.642361111111111 | 7.887 |
| 0.6430555555555556 | 7.887 |
| 0.6437499999999999 | 7.887 |
| 0.6444444444444445 | 7.887 |
| 0.6451388888888888 | 7.887 |
| 0.6458333333333334 | 7.887 |
| 0.6465277777777778 | 7.887 |
| 0.6472222222222223 | 7.887 |
| 0.6479166666666667 | 7.887 |
| 0.6486111111111111 | 7.887 |
| 0.6493055555555556 | 7.887 |
| 0.65 | 7.887 |
| 0.6506944444444445 | 7.887 |
| 0.6513888888888889 | 7.887 |
| 0.6520833333333333 | 7.887 |
| 0.6527777777777778 | 7.887 |
| 0.6534722222222222 | 7.887 |
| 0.6541666666666667 | 7.887 |
| 0.6548611111111111 | 7.887 |
| 0.6555555555555556 | 7.887 |
| 0.65625 | 7.887 |
| 0.6569444444444444 | 7.887 |
| 0.6576388888888889 | 7.887 |
| 0.6583333333333333 | 7.887 |
| 0.6590277777777778 | 7.887 |
| 0.6597222222222222 | 7.887 |
| 0.6604166666666667 | 7.887 |
| 0.6611111111111111 | 7.887 |
| 0.6618055555555555 | 3.525 |
| 0.6625 | 3.525 |
| 0.6631944444444444 | 3.525 |
| 0.6638888888888889 | 3.525 |
| 0.6645833333333333 | 3.525 |
| 0.6652777777777777 | 3.525 |
| 0.6659722222222222 | 3.525 |
| 0.6666666666666666 | 3.525 |
| 0.6673611111111111 | 3.525 |
| 0.6680555555555556 | 3.525 |
| 0.6687500000000001 | 3.525 |
| 0.6694444444444444 | 3.525 |
| 0.6701388888888888 | 3.525 |
| 0.6708333333333334 | 3.525 |
| 0.6715277777777778 | 3.525 |
| 0.6722222222222222 | 3.525 |
| 0.6729166666666666 | 3.525 |
| 0.6736111111111112 | 3.525 |
| 0.6743055555555556 | 3.525 |
| 0.6749999999999999 | 3.525 |
| 0.6756944444444444 | 3.525 |
| 0.6763888888888889 | 3.525 |
| 0.6770833333333334 | 3.525 |
| 0.6777777777777777 | 3.525 |
| 0.6784722222222223 | 3.525 |
| 0.6791666666666667 | 3.525 |
| 0.6798611111111111 | 3.525 |
| 0.6805555555555555 | 3.525 |
| 0.68125 | 3.525 |
| 0.6819444444444445 | 3.525 |
| 0.6826388888888889 | 3.525 |
| 0.6833333333333332 | 3.525 |
| 0.6840277777777778 | 3.525 |
| 0.6847222222222222 | 3.525 |
| 0.6854166666666667 | 3.525 |
| 0.686111111111111 | 3.525 |
| 0.6868055555555556 | 3.525 |
| 0.6875 | 3.525 |
| 0.6881944444444444 | 0 |
| 0.688888888888889 | 0 |
| 0.6895833333333333 | 3.525 |
| 0.6902777777777778 | 0 |
| 0.6909722222222222 | 0 |
| 0.6916666666666668 | 0 |
| 0.6923611111111111 | 0 |
| 0.6930555555555555 | 0 |
| 0.69375 | 0 |
| 0.6944444444444445 | 0 |
| 0.6951388888888889 | 0 |
| 0.6958333333333333 | 0 |
| 0.6965277777777777 | 0 |
| 0.6972222222222223 | 0 |
| 0.6979166666666666 | 0 |
| 0.6986111111111111 | 0 |
| 0.6993055555555556 | 0 |
| 0.7000000000000001 | 0 |
| 0.7006944444444444 | 0 |
| 0.7013888888888888 | 0 |
| 0.7020833333333334 | 0 |
| 0.7027777777777778 | 0 |
| 0.7034722222222222 | 0 |
| 0.7041666666666666 | 0 |
| 0.7048611111111112 | 0 |
| 0.7055555555555556 | 0 |
| 0.7062499999999999 | 0 |
| 0.7069444444444444 | 0 |
| 0.7076388888888889 | 0 |
| 0.7083333333333334 | 0 |
| 0.7090277777777777 | 0 |
| 0.7097222222222223 | 0 |
| 0.7104166666666667 | 0 |
| 0.7111111111111111 | 0 |
| 0.7118055555555555 | 0 |
| 0.7125 | 0 |
| 0.7131944444444445 | 0 |
| 0.7138888888888889 | 0 |
| 0.7145833333333332 | 0 |
| 0.7152777777777778 | 0 |
| 0.7159722222222222 | 0 |
| 0.7166666666666667 | 0 |
| 0.717361111111111 | 0 |
| 0.7180555555555556 | 0 |
| 0.71875 | 0 |
| 0.7194444444444444 | 0 |
| 0.720138888888889 | 0 |
| 0.7208333333333333 | 0 |
| 0.7215277777777778 | 0 |
| 0.7222222222222222 | 0 |
| 0.7229166666666668 | 0 |
| 0.7236111111111111 | 0 |
| 0.7243055555555555 | 0 |
| 0.725 | 0 |
| 0.7256944444444445 | 0 |
| 0.7263888888888889 | 0 |
| 0.7270833333333333 | 0 |
| 0.7277777777777777 | 0 |
| 0.7284722222222223 | 0 |
| 0.7291666666666666 | 0 |
| 0.7298611111111111 | 0 |
| 0.7305555555555556 | 0 |
| 0.7312500000000001 | 0 |
| 0.7319444444444444 | 0 |
| 0.7326388888888888 | 0 |
| 0.7333333333333334 | 0 |
| 0.7340277777777778 | 0 |
| 0.7347222222222222 | 0 |
| 0.7354166666666666 | 0 |
| 0.7361111111111112 | 0 |
| 0.7368055555555556 | 0 |
| 0.7374999999999999 | 0 |
| 0.7381944444444444 | 0 |
| 0.7388888888888889 | 0 |
| 0.7395833333333334 | 0 |
| 0.7402777777777777 | 0 |
| 0.7409722222222223 | 0 |
| 0.7416666666666667 | 0 |
| 0.7423611111111111 | 0 |
| 0.7430555555555555 | 0 |
| 0.74375 | 0 |
| 0.7444444444444445 | 0 |
| 0.7451388888888889 | 0 |
| 0.7458333333333332 | 0 |
| 0.7465277777777778 | 0 |
| 0.7472222222222222 | 0 |
| 0.7479166666666667 | 0 |
| 0.748611111111111 | 0 |
| 0.7493055555555556 | 0 |
| 0.75 | 0 |
| 0.7506944444444444 | 0 |
| 0.751388888888889 | 0 |
| 0.7520833333333333 | 0 |
| 0.7527777777777778 | 0 |
| 0.7534722222222222 | 0 |
| 0.7541666666666668 | 0 |
| 0.7548611111111111 | 0 |
| 0.7555555555555555 | 0 |
| 0.75625 | 0 |
| 0.7569444444444445 | 0 |
| 0.7576388888888889 | 0 |
| 0.7583333333333333 | 0 |
| 0.7590277777777777 | 0 |
| 0.7597222222222223 | 0 |
| 0.7604166666666666 | 0 |
| 0.7611111111111111 | 0 |
| 0.7618055555555556 | 0 |
| 0.7625000000000001 | 0 |
| 0.7631944444444444 | 0 |
| 0.7638888888888888 | 0 |
| 0.7645833333333334 | 0 |
| 0.7652777777777778 | 0 |
| 0.7659722222222222 | 0 |
| 0.7666666666666666 | 0 |
| 0.7673611111111112 | 0 |
| 0.7680555555555556 | 0 |
| 0.7687499999999999 | 0 |
| 0.7694444444444444 | 0 |
| 0.7701388888888889 | 0 |
| 0.7708333333333334 | 0 |
| 0.7715277777777777 | 0 |
| 0.7722222222222223 | 0 |
| 0.7729166666666667 | 0 |
| 0.7736111111111111 | 0 |
| 0.7743055555555555 | 0 |
| 0.775 | 0 |
| 0.7756944444444445 | 0 |
| 0.7763888888888889 | 0 |
| 0.7770833333333332 | 0 |
| 0.7777777777777778 | 0 |
| 0.7784722222222222 | 0 |
| 0.7791666666666667 | 0 |
| 0.779861111111111 | 0 |
| 0.7805555555555556 | 0 |
| 0.78125 | 0 |
| 0.7819444444444444 | 0 |
| 0.782638888888889 | 0 |
| 0.7833333333333333 | 0 |
| 0.7840277777777778 | 0 |
| 0.7847222222222222 | 0 |
| 0.7854166666666668 | 0 |
| 0.7861111111111111 | 0 |
| 0.7868055555555555 | 0 |
| 0.7875 | 0 |
| 0.7881944444444445 | 0 |
| 0.7888888888888889 | 0 |
| 0.7895833333333333 | 0 |
| 0.7902777777777777 | 0 |
| 0.7909722222222223 | 0 |
| 0.7916666666666666 | 0 |
| 0.7923611111111111 | 0 |
| 0.7930555555555556 | 0 |
| 0.7937500000000001 | 0 |
| 0.7944444444444444 | 0 |
| 0.7951388888888888 | 0 |
| 0.7958333333333334 | 0 |
| 0.7965277777777778 | 0 |
| 0.7972222222222222 | 0 |
| 0.7979166666666666 | 0 |
| 0.7986111111111112 | 0 |
| 0.7993055555555556 | 0 |
| 0.7999999999999999 | 0 |
| 0.8006944444444444 | 0 |
| 0.8013888888888889 | 0 |
| 0.8020833333333334 | 0 |
| 0.8027777777777777 | 0 |
| 0.8034722222222223 | 0 |
| 0.8041666666666667 | 0 |
| 0.8048611111111111 | 0 |
| 0.8055555555555555 | 0 |
| 0.80625 | 0 |
| 0.8069444444444445 | 0 |
| 0.8076388888888889 | 0 |
| 0.8083333333333332 | 0 |
| 0.8090277777777778 | 0 |
| 0.8097222222222222 | 0 |
| 0.8104166666666667 | 0 |
| 0.811111111111111 | 0 |
| 0.8118055555555556 | 0 |
| 0.8125 | 0 |
| 0.8131944444444444 | 0 |
| 0.813888888888889 | 0 |
| 0.8145833333333333 | 0 |
| 0.8152777777777778 | 0 |
| 0.8159722222222222 | 0 |
| 0.8166666666666668 | 0 |
| 0.8173611111111111 | 0 |
| 0.8180555555555555 | 0 |
| 0.81875 | 0 |
| 0.8194444444444445 | 0 |
| 0.8201388888888889 | 0 |
| 0.8208333333333333 | 0 |
| 0.8215277777777777 | 0 |
| 0.8222222222222223 | 0 |
| 0.8229166666666666 | 0 |
| 0.8236111111111111 | 0 |
| 0.8243055555555556 | 0 |
| 0.8250000000000001 | 0 |
| 0.8256944444444444 | 0 |
| 0.8263888888888888 | 0 |
| 0.8270833333333334 | 0 |
| 0.8277777777777778 | 0 |
| 0.8284722222222222 | 0 |
| 0.8291666666666666 | 0 |
| 0.8298611111111112 | 0 |
| 0.8305555555555556 | 0 |
| 0.8312499999999999 | 0 |
| 0.8319444444444444 | 0 |
| 0.8326388888888889 | 0 |
| 0.8333333333333334 | 0 |
| 0.8340277777777777 | 0 |
| 0.8347222222222223 | 0 |
| 0.8354166666666667 | 0 |
| 0.8361111111111111 | 0 |
| 0.8368055555555555 | 0 |
| 0.8375 | 0 |
| 0.8381944444444445 | 0 |
| 0.8388888888888889 | 0 |
| 0.8395833333333332 | 0 |
| 0.8402777777777778 | 0 |
| 0.8409722222222222 | 0 |
| 0.8416666666666667 | 0 |
| 0.842361111111111 | 0 |
| 0.8430555555555556 | 0 |
| 0.84375 | 0 |
| 0.8444444444444444 | 0 |
| 0.845138888888889 | 0 |
| 0.8458333333333333 | 0 |
| 0.8465277777777778 | 0 |
| 0.8472222222222222 | 0 |
| 0.8479166666666668 | 0 |
| 0.8486111111111111 | 0 |
| 0.8493055555555555 | 0 |
| 0.85 | 0 |
| 0.8506944444444445 | 0 |
| 0.8513888888888889 | 0 |
| 0.8520833333333333 | 0 |
| 0.8527777777777777 | 0 |
| 0.8534722222222223 | 0 |
| 0.8541666666666666 | 0 |
| 0.8548611111111111 | 0 |
| 0.8555555555555556 | 0 |
| 0.8562500000000001 | 0 |
| 0.8569444444444444 | 0 |
| 0.8576388888888888 | 0 |
| 0.8583333333333334 | 0 |
| 0.8590277777777778 | 0 |
| 0.8597222222222222 | 0 |
| 0.8604166666666666 | 0 |
| 0.8611111111111112 | 0 |
| 0.8618055555555556 | 0 |
| 0.8624999999999999 | 0 |
| 0.8631944444444444 | 0 |
| 0.8638888888888889 | 0 |
| 0.8645833333333334 | 0 |
| 0.8652777777777777 | 0 |
| 0.8659722222222223 | 0 |
| 0.8666666666666667 | 0 |
| 0.8673611111111111 | 0 |
| 0.8680555555555555 | 0 |
| 0.86875 | 0 |
| 0.8694444444444445 | 0 |
| 0.8701388888888889 | 0 |
| 0.8708333333333332 | 0 |
| 0.8715277777777778 | 0 |
| 0.8722222222222222 | 0 |
| 0.8729166666666667 | 0 |
| 0.873611111111111 | 0 |
| 0.8743055555555556 | 0 |
| 0.875 | 0 |
| 0.8756944444444444 | 0 |
| 0.876388888888889 | 0 |
| 0.8770833333333333 | 0 |
| 0.8777777777777778 | 0 |
| 0.8784722222222222 | 0 |
| 0.8791666666666668 | 0 |
| 0.8798611111111111 | 0 |
| 0.8805555555555555 | 0 |
| 0.88125 | 0 |
| 0.8819444444444445 | 0 |
| 0.8826388888888889 | 0 |
| 0.8833333333333333 | 0 |
| 0.8840277777777777 | 0 |
| 0.8847222222222223 | 0 |
| 0.8854166666666666 | 0 |
| 0.8861111111111111 | 0 |
| 0.8868055555555556 | 0 |
| 0.8875000000000001 | 0 |
| 0.8881944444444444 | 0 |
| 0.8888888888888888 | 0 |
| 0.8895833333333334 | 0 |
| 0.8902777777777778 | 0 |
| 0.8909722222222222 | 0 |
| 0.8916666666666666 | 0 |
| 0.8923611111111112 | 0 |
| 0.8930555555555556 | 0 |
| 0.8937499999999999 | 0 |
| 0.8944444444444444 | 0 |
| 0.8951388888888889 | 0 |
| 0.8958333333333334 | 0 |
| 0.8965277777777777 | 0 |
| 0.8972222222222223 | 0 |
| 0.8979166666666667 | 0 |
| 0.8986111111111111 | 0 |
| 0.8993055555555555 | 0 |
| 0.9 | 0 |
| 0.9006944444444445 | 0 |
| 0.9013888888888889 | 0 |
| 0.9020833333333332 | 0 |
| 0.9027777777777778 | 0 |
| 0.9034722222222222 | 0 |
| 0.9041666666666667 | 0 |
| 0.904861111111111 | 0 |
| 0.9055555555555556 | 0 |
| 0.90625 | 0 |
| 0.9069444444444444 | 0 |
| 0.907638888888889 | 0 |
| 0.9083333333333333 | 0 |
| 0.9090277777777778 | 0 |
| 0.9097222222222222 | 0 |
| 0.9104166666666668 | 0 |
| 0.9111111111111111 | 0 |
| 0.9118055555555555 | 0 |
| 0.9125 | 0 |
| 0.9131944444444445 | 0 |
| 0.9138888888888889 | 0 |
| 0.9145833333333333 | 0 |
| 0.9152777777777777 | 0 |
| 0.9159722222222223 | 0 |
| 0.9166666666666666 | 0 |
| 0.9173611111111111 | 0 |
| 0.9180555555555556 | 0 |
| 0.9187500000000001 | 0 |
| 0.9194444444444444 | 0 |
| 0.9201388888888888 | 0 |
| 0.9208333333333334 | 0 |
| 0.9215277777777778 | 0 |
| 0.9222222222222222 | 0 |
| 0.9229166666666666 | 0 |
| 0.9236111111111112 | 0 |
| 0.9243055555555556 | 0 |
| 0.9249999999999999 | 0 |
| 0.9256944444444444 | 0 |
| 0.9263888888888889 | 0 |
| 0.9270833333333334 | 0 |
| 0.9277777777777777 | 0 |
| 0.9284722222222223 | 0 |
| 0.9291666666666667 | 0 |
| 0.9298611111111111 | 0 |
| 0.9305555555555555 | 0 |
| 0.93125 | 0 |
| 0.9319444444444445 | 0 |
| 0.9326388888888889 | 0 |
| 0.9333333333333332 | 0 |
| 0.9340277777777778 | 0 |
| 0.9347222222222222 | 0 |
| 0.9354166666666667 | 0 |
| 0.936111111111111 | 0 |
| 0.9368055555555556 | 0 |
| 0.9375 | 0 |
| 0.9381944444444444 | 0 |
| 0.938888888888889 | 0 |
| 0.9395833333333333 | 0 |
| 0.9402777777777778 | 0 |
| 0.9409722222222222 | 0 |
| 0.9416666666666668 | 0 |
| 0.9423611111111111 | 0 |
| 0.9430555555555555 | 0 |
| 0.94375 | 0 |
| 0.9444444444444445 | 0 |
| 0.9451388888888889 | 0 |
| 0.9458333333333333 | 0 |
| 0.9465277777777777 | 0 |
| 0.9472222222222223 | 0 |
| 0.9479166666666666 | 0 |
| 0.9486111111111111 | 0 |
| 0.9493055555555556 | 0 |
| 0.9500000000000001 | 0 |
| 0.9506944444444444 | 0 |
| 0.9513888888888888 | 0 |
| 0.9520833333333334 | 0 |
| 0.9527777777777778 | 0 |
| 0.9534722222222222 | 0 |
| 0.9541666666666666 | 0 |
| 0.9548611111111112 | 0 |
| 0.9555555555555556 | 0 |
| 0.9562499999999999 | 0 |
| 0.9569444444444444 | 0 |
| 0.9576388888888889 | 0 |
| 0.9583333333333334 | 0 |
| 0.9590277777777777 | 0 |
| 0.9597222222222223 | 0 |
| 0.9604166666666667 | 0 |
| 0.9611111111111111 | 0 |
| 0.9618055555555555 | 0 |
| 0.9625 | 0 |
| 0.9631944444444445 | 0 |
| 0.9638888888888889 | 0 |
| 0.9645833333333332 | 0 |
| 0.9652777777777778 | 0 |
| 0.9659722222222222 | 0 |
| 0.9666666666666667 | 0 |
| 0.967361111111111 | 0 |
| 0.9680555555555556 | 0 |
| 0.96875 | 0 |
| 0.9694444444444444 | 0 |
| 0.970138888888889 | 0 |
| 0.9708333333333333 | 0 |
| 0.9715277777777778 | 0 |
| 0.9722222222222222 | 0 |
| 0.9729166666666668 | 0 |
| 0.9736111111111111 | 0 |
| 0.9743055555555555 | 0 |
| 0.975 | 0 |
| 0.9756944444444445 | 0 |
| 0.9763888888888889 | 0 |
| 0.9770833333333333 | 0 |
| 0.9777777777777777 | 0 |
| 0.9784722222222223 | 0 |
| 0.9791666666666666 | 0 |
| 0.9798611111111111 | 0 |
| 0.9805555555555556 | 0 |
| 0.9812500000000001 | 0 |
| 0.9819444444444444 | 0 |
| 0.9826388888888888 | 0 |
| 0.9833333333333334 | 0 |
| 0.9840277777777778 | 0 |
| 0.9847222222222222 | 0 |
| 0.9854166666666666 | 0 |
| 0.9861111111111112 | 0 |
| 0.9868055555555556 | 0 |
| 0.9874999999999999 | 0 |
| 0.9881944444444444 | 0 |
| 0.9888888888888889 | 0 |
| 0.9895833333333334 | 0 |
| 0.9902777777777777 | 0 |
| 0.9909722222222223 | 0 |
| 0.9916666666666667 | 0 |
| 0.9923611111111111 | 0 |
| 0.9930555555555555 | 0 |
| 0.99375 | 0 |
| 0.9944444444444445 | 0 |
| 0.9951388888888889 | 0 |
| 0.9958333333333332 | 0 |
| 0.9965277777777778 | 0 |
| 0.9972222222222222 | 0 |
| 0.9979166666666667 | 0 |
| 0.998611111111111 | 0 |
| 0.9993055555555556 | 0 |